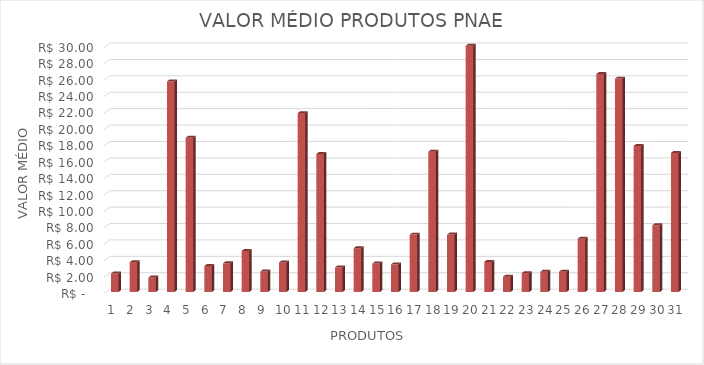
| Category | Series 0 |
|---|---|
| 0 | 2.25 |
| 1 | 3.63 |
| 2 | 1.763 |
| 3 | 25.663 |
| 4 | 18.797 |
| 5 | 3.163 |
| 6 | 3.497 |
| 7 | 4.997 |
| 8 | 2.497 |
| 9 | 3.597 |
| 10 | 21.795 |
| 11 | 16.817 |
| 12 | 3 |
| 13 | 5.33 |
| 14 | 3.463 |
| 15 | 3.363 |
| 16 | 6.993 |
| 17 | 17.1 |
| 18 | 6.997 |
| 19 | 44.4 |
| 20 | 3.663 |
| 21 | 1.863 |
| 22 | 2.29 |
| 23 | 2.463 |
| 24 | 2.463 |
| 25 | 6.497 |
| 26 | 26.557 |
| 27 | 26 |
| 28 | 17.8 |
| 29 | 8.13 |
| 30 | 16.95 |